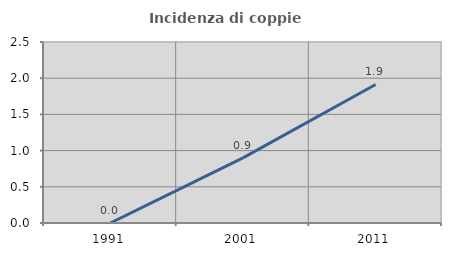
| Category | Incidenza di coppie miste |
|---|---|
| 1991.0 | 0 |
| 2001.0 | 0.9 |
| 2011.0 | 1.914 |